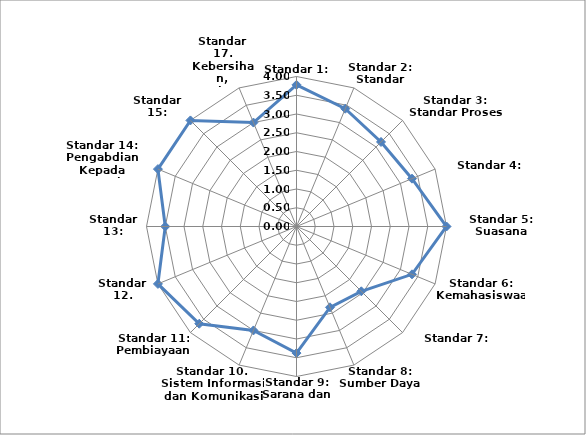
| Category | Nilai per standar |
|---|---|
| Standar 1: Identitas | 3.778 |
| Standar 2: Standar Kurikulum | 3.4 |
| Standar 3: Standar Proses | 3.188 |
| Standar 4: Evaluasi | 3.333 |
| Standar 5: Suasana Akademik | 4 |
| Standar 6: Kemahasiswaan | 3.333 |
| Standar 7: Lulusan  | 2.444 |
| Standar 8: Sumber Daya Manusia | 2.333 |
| Standar 9: Sarana dan Prasarana  | 3.375 |
| Standar 10. Sistem Informasi dan Komunikasi | 3 |
| Standar 11: Pembiayaan  | 3.667 |
| Standar 12. Pengelolaan | 4 |
| Standar 13: Penelitian | 3.5 |
| Standar 14: Pengabdian Kepada Masyarakat | 4 |
| Standar 15: Kerjasama  | 4 |
| Standar 17. Kebersihan, Kesehatan  Lingkungan | 3 |